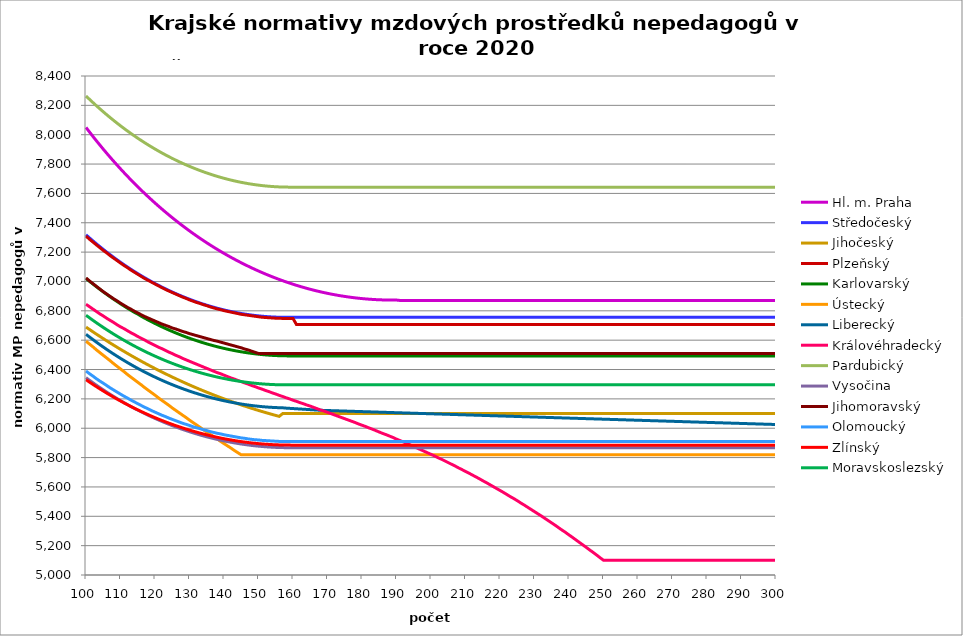
| Category | Hl. m. Praha | Středočeský | Jihočeský | Plzeňský | Karlovarský  | Ústecký   | Liberecký | Královéhradecký | Pardubický | Vysočina | Jihomoravský | Olomoucký | Zlínský | Moravskoslezský |
|---|---|---|---|---|---|---|---|---|---|---|---|---|---|---|
| 100.0 | 8049.459 | 7317.95 | 6689.328 | 7309.41 | 7020.45 | 6592.885 | 6640.033 | 6844.813 | 8263.735 | 6344.177 | 7024.173 | 6389.799 | 6330.586 | 6769.877 |
| 101.0 | 8018.772 | 7297.191 | 6673.159 | 7288.1 | 7001.348 | 6573.831 | 6621.872 | 6828.381 | 8241.249 | 6326.929 | 7003.797 | 6371.744 | 6314.544 | 6752.521 |
| 102.0 | 7988.661 | 7276.908 | 6657.222 | 7268.834 | 6982.672 | 6554.886 | 6604.117 | 6812.028 | 8219.266 | 6310.062 | 6985.376 | 6355.419 | 6298.856 | 6735.554 |
| 103.0 | 7959.116 | 7257.093 | 6641.513 | 7249.67 | 6964.418 | 6534.343 | 6586.763 | 6795.753 | 8197.779 | 6293.571 | 6967.051 | 6337.557 | 6283.516 | 6718.969 |
| 104.0 | 7930.127 | 7237.74 | 6626.03 | 7230.607 | 6946.579 | 6515.625 | 6569.805 | 6779.555 | 8176.781 | 6277.45 | 6948.823 | 6321.407 | 6268.52 | 6702.761 |
| 105.0 | 7901.684 | 7218.842 | 6610.77 | 7211.644 | 6929.15 | 6497.014 | 6553.236 | 6765.222 | 8156.265 | 6261.695 | 6930.689 | 6306.941 | 6253.863 | 6686.926 |
| 106.0 | 7873.778 | 7200.394 | 6595.731 | 7194.662 | 6912.125 | 6478.509 | 6537.053 | 6749.17 | 8136.226 | 6246.301 | 6914.449 | 6290.946 | 6239.542 | 6671.459 |
| 107.0 | 7846.399 | 7182.388 | 6580.909 | 7175.887 | 6895.5 | 6460.108 | 6521.249 | 6734.964 | 8116.656 | 6231.263 | 6898.286 | 6275.032 | 6225.551 | 6656.355 |
| 108.0 | 7819.538 | 7164.818 | 6566.303 | 7159.073 | 6879.268 | 6440.154 | 6505.82 | 6720.819 | 8097.549 | 6216.575 | 6882.197 | 6260.777 | 6211.888 | 6641.61 |
| 109.0 | 7793.187 | 7147.68 | 6551.91 | 7142.338 | 6863.425 | 6421.971 | 6490.761 | 6704.976 | 8078.901 | 6202.235 | 6867.96 | 6246.588 | 6198.547 | 6627.22 |
| 110.0 | 7767.338 | 7130.968 | 6537.728 | 7125.68 | 6847.966 | 6403.89 | 6476.067 | 6690.957 | 8060.704 | 6188.376 | 6852.012 | 6232.462 | 6185.526 | 6613.18 |
| 111.0 | 7741.982 | 7114.676 | 6523.755 | 7109.1 | 6832.887 | 6385.911 | 6461.734 | 6678.737 | 8042.954 | 6174.716 | 6837.899 | 6218.401 | 6172.821 | 6599.487 |
| 112.0 | 7717.11 | 7098.798 | 6509.987 | 7094.427 | 6818.182 | 6366.412 | 6447.758 | 6664.827 | 8025.645 | 6161.39 | 6823.844 | 6205.954 | 6160.428 | 6586.135 |
| 113.0 | 7692.717 | 7083.331 | 6496.424 | 7077.992 | 6803.847 | 6348.642 | 6434.134 | 6650.974 | 8008.773 | 6148.395 | 6811.593 | 6192.012 | 6148.343 | 6573.123 |
| 114.0 | 7668.793 | 7068.268 | 6483.062 | 7063.447 | 6789.879 | 6330.972 | 6420.858 | 6638.9 | 7992.331 | 6135.862 | 6797.645 | 6179.671 | 6136.564 | 6560.445 |
| 115.0 | 7645.332 | 7053.606 | 6469.9 | 7048.962 | 6777.967 | 6313.399 | 6407.927 | 6625.155 | 7976.315 | 6123.516 | 6785.488 | 6167.379 | 6125.087 | 6548.099 |
| 116.0 | 7622.326 | 7039.34 | 6456.935 | 7034.536 | 6763.025 | 6295.924 | 6395.336 | 6613.175 | 7960.72 | 6111.624 | 6773.374 | 6155.136 | 6113.91 | 6536.08 |
| 117.0 | 7599.769 | 7025.464 | 6444.166 | 7020.168 | 6750.131 | 6276.969 | 6383.082 | 6601.238 | 7945.543 | 6099.912 | 6761.303 | 6142.942 | 6103.028 | 6524.386 |
| 118.0 | 7577.653 | 7011.976 | 6431.59 | 7007.645 | 6737.587 | 6259.695 | 6371.161 | 6587.648 | 7930.778 | 6088.513 | 6750.991 | 6132.311 | 6092.439 | 6513.013 |
| 119.0 | 7555.973 | 6998.871 | 6419.205 | 6995.167 | 6725.39 | 6242.515 | 6359.57 | 6575.803 | 7916.42 | 6077.556 | 6740.711 | 6120.207 | 6082.14 | 6501.959 |
| 120.0 | 7534.722 | 6986.144 | 6407.01 | 6982.732 | 6713.536 | 6225.429 | 6348.305 | 6564 | 7902.467 | 6066.905 | 6730.461 | 6109.655 | 6072.129 | 6491.219 |
| 121.0 | 7513.894 | 6973.792 | 6395.003 | 6970.342 | 6702.022 | 6206.897 | 6337.363 | 6552.24 | 7888.914 | 6056.555 | 6720.243 | 6099.139 | 6062.402 | 6480.792 |
| 122.0 | 7493.482 | 6961.812 | 6383.182 | 6957.996 | 6690.844 | 6190.005 | 6326.742 | 6542.193 | 7875.757 | 6046.374 | 6710.056 | 6088.66 | 6052.958 | 6470.674 |
| 123.0 | 7473.481 | 6950.199 | 6371.544 | 6945.693 | 6680 | 6173.205 | 6316.437 | 6530.51 | 7862.993 | 6036.489 | 6701.59 | 6079.706 | 6043.793 | 6460.862 |
| 124.0 | 7453.886 | 6938.951 | 6360.089 | 6935.183 | 6669.487 | 6156.496 | 6306.446 | 6518.869 | 7850.617 | 6027.03 | 6693.145 | 6069.293 | 6034.906 | 6451.355 |
| 125.0 | 7434.69 | 6928.063 | 6348.814 | 6924.704 | 6659.3 | 6138.371 | 6296.767 | 6508.924 | 7838.627 | 6017.862 | 6683.04 | 6060.396 | 6026.293 | 6442.149 |
| 126.0 | 7415.888 | 6917.533 | 6337.718 | 6914.257 | 6649.438 | 6121.85 | 6287.396 | 6497.36 | 7827.018 | 6008.983 | 6676.32 | 6051.525 | 6017.954 | 6433.241 |
| 127.0 | 7397.475 | 6907.358 | 6326.8 | 6903.841 | 6639.898 | 6105.417 | 6278.331 | 6487.481 | 7815.789 | 6000.26 | 6667.939 | 6042.68 | 6009.885 | 6424.631 |
| 128.0 | 7379.446 | 6897.533 | 6316.056 | 6893.457 | 6630.677 | 6089.073 | 6269.569 | 6475.993 | 7804.935 | 5991.951 | 6659.579 | 6033.86 | 6002.084 | 6416.314 |
| 129.0 | 7361.797 | 6888.058 | 6305.487 | 6884.827 | 6621.773 | 6072.816 | 6261.108 | 6466.178 | 7794.453 | 5983.924 | 6652.906 | 6026.531 | 5994.55 | 6408.29 |
| 130.0 | 7344.521 | 6878.929 | 6295.09 | 6874.5 | 6613.182 | 6055.179 | 6252.946 | 6456.393 | 7784.342 | 5976.176 | 6644.583 | 6019.219 | 5987.28 | 6400.556 |
| 131.0 | 7327.615 | 6870.142 | 6284.863 | 6865.918 | 6604.904 | 6039.102 | 6245.08 | 6446.638 | 7774.597 | 5968.706 | 6637.941 | 6010.468 | 5980.273 | 6393.109 |
| 132.0 | 7311.074 | 6861.697 | 6274.806 | 6857.357 | 6596.935 | 6023.11 | 6237.508 | 6436.912 | 7765.217 | 5961.51 | 6631.311 | 6003.195 | 5973.527 | 6385.949 |
| 133.0 | 7294.894 | 6853.589 | 6264.917 | 6850.523 | 6589.273 | 6007.203 | 6230.229 | 6427.216 | 7756.199 | 5954.46 | 6624.694 | 5997.389 | 5967.041 | 6379.073 |
| 134.0 | 7279.07 | 6845.818 | 6255.194 | 6842 | 6581.917 | 5989.945 | 6223.24 | 6417.548 | 7747.54 | 5947.81 | 6618.091 | 5990.147 | 5960.811 | 6372.479 |
| 135.0 | 7263.598 | 6838.38 | 6245.637 | 6835.198 | 6574.864 | 5974.212 | 6216.538 | 6407.91 | 7739.238 | 5941.558 | 6611.501 | 5984.367 | 5954.838 | 6366.166 |
| 136.0 | 7248.475 | 6831.275 | 6236.243 | 6826.713 | 6568.113 | 5958.562 | 6210.124 | 6398.3 | 7731.29 | 5935.445 | 6604.924 | 5977.157 | 5949.119 | 6360.131 |
| 137.0 | 7233.695 | 6824.498 | 6227.011 | 6819.94 | 6561.661 | 5942.993 | 6203.994 | 6388.72 | 7723.696 | 5929.599 | 6598.36 | 5971.401 | 5943.654 | 6354.375 |
| 138.0 | 7219.256 | 6818.049 | 6217.94 | 6813.181 | 6555.507 | 5927.505 | 6198.147 | 6379.168 | 7716.452 | 5924.018 | 6593.446 | 5965.657 | 5938.44 | 6348.894 |
| 139.0 | 7205.153 | 6811.927 | 6209.029 | 6808.121 | 6549.649 | 5910.702 | 6192.582 | 6371.229 | 7709.557 | 5918.701 | 6586.905 | 5961.355 | 5933.476 | 6343.688 |
| 140.0 | 7191.384 | 6806.128 | 6200.276 | 6801.385 | 6544.086 | 5895.382 | 6187.296 | 6361.73 | 7703.008 | 5913.771 | 6580.377 | 5955.63 | 5928.762 | 6338.755 |
| 141.0 | 7177.944 | 6800.652 | 6191.68 | 6796.342 | 6538.816 | 5880.141 | 6182.289 | 6352.258 | 7696.805 | 5908.976 | 6573.861 | 5951.344 | 5924.295 | 6334.094 |
| 142.0 | 7164.83 | 6795.497 | 6183.241 | 6791.306 | 6533.838 | 5864.979 | 6177.56 | 6342.815 | 7690.945 | 5904.441 | 6567.359 | 5947.063 | 5920.076 | 6329.704 |
| 143.0 | 7152.038 | 6790.661 | 6174.956 | 6786.278 | 6529.15 | 5848.527 | 6173.107 | 6334.967 | 7685.428 | 5900.164 | 6560.87 | 5942.789 | 5916.102 | 6325.584 |
| 144.0 | 7139.567 | 6786.144 | 6166.825 | 6781.258 | 6524.752 | 5833.528 | 6168.928 | 6325.574 | 7680.25 | 5896.27 | 6554.393 | 5938.52 | 5912.373 | 6321.732 |
| 145.0 | 7127.412 | 6781.943 | 6158.847 | 6776.244 | 6520.641 | 5818.605 | 6165.023 | 6317.769 | 7675.412 | 5892.506 | 6547.929 | 5934.258 | 5908.888 | 6318.148 |
| 146.0 | 7115.571 | 6778.059 | 6151.019 | 6772.906 | 6516.818 | 5818.605 | 6161.391 | 6308.428 | 7670.912 | 5889.123 | 6539.867 | 5931.42 | 5905.647 | 6314.831 |
| 147.0 | 7104.04 | 6774.489 | 6143.343 | 6769.572 | 6513.281 | 5818.605 | 6158.031 | 6300.665 | 7666.748 | 5885.869 | 6533.432 | 5927.168 | 5902.647 | 6311.78 |
| 148.0 | 7092.817 | 6771.232 | 6135.815 | 6766.24 | 6510.029 | 5818.605 | 6154.941 | 6291.374 | 7662.92 | 5882.868 | 6525.405 | 5924.337 | 5899.889 | 6308.994 |
| 149.0 | 7081.899 | 6768.289 | 6128.436 | 6762.912 | 6507.061 | 5818.605 | 6152.122 | 6283.652 | 7659.427 | 5880.245 | 6517.399 | 5921.509 | 5897.373 | 6306.473 |
| 150.0 | 7071.283 | 6765.657 | 6121.204 | 6759.587 | 6504.377 | 5818.605 | 6149.572 | 6274.412 | 7656.267 | 5877.873 | 6509.412 | 5920.095 | 5895.096 | 6304.215 |
| 151.0 | 7060.967 | 6763.337 | 6114.119 | 6756.265 | 6501.976 | 5818.605 | 6147.29 | 6266.732 | 7653.441 | 5875.753 | 6509.412 | 5917.271 | 5893.059 | 6302.221 |
| 152.0 | 7050.949 | 6761.328 | 6107.178 | 6754.606 | 6499.856 | 5818.605 | 6145.277 | 6257.541 | 7650.946 | 5873.759 | 6509.412 | 5915.86 | 5891.261 | 6300.489 |
| 153.0 | 7041.225 | 6759.628 | 6100.383 | 6752.947 | 6498.018 | 5818.605 | 6143.531 | 6249.902 | 7648.783 | 5872.016 | 6509.412 | 5914.449 | 5889.703 | 6299.02 |
| 154.0 | 7031.794 | 6758.239 | 6093.73 | 6751.289 | 6496.462 | 5818.605 | 6142.052 | 6240.761 | 7646.951 | 5870.646 | 6509.412 | 5913.039 | 5888.382 | 6297.813 |
| 155.0 | 7022.654 | 6757.158 | 6087.221 | 6749.632 | 6495.186 | 5818.605 | 6140.84 | 6233.163 | 7645.449 | 5869.527 | 6509.412 | 5911.63 | 5887.3 | 6296.868 |
| 156.0 | 7013.801 | 6756.386 | 6080.853 | 6749.632 | 6494.191 | 5818.605 | 6139.894 | 6224.07 | 7644.277 | 5868.656 | 6509.412 | 5910.222 | 5886.456 | 6296.184 |
| 157.0 | 7005.235 | 6755.924 | 6099.74 | 6747.975 | 6493.475 | 5818.605 | 6139.215 | 6216.513 | 7643.435 | 5868.034 | 6509.412 | 5910.222 | 5885.849 | 6295.762 |
| 158.0 | 6996.953 | 6755.769 | 6099.74 | 6747.975 | 6493.04 | 5818.605 | 6137 | 6207.468 | 7642.923 | 5867.537 | 6509.412 | 5908.814 | 5885.479 | 6295.754 |
| 159.0 | 6988.953 | 6755.924 | 6099.74 | 6747.975 | 6492.885 | 5818.605 | 6135.525 | 6199.952 | 7642.74 | 5867.412 | 6509.412 | 5908.814 | 5885.348 | 6295.7 |
| 160.0 | 6981.233 | 6755.769 | 6099.74 | 6747.975 | 6493.009 | 5818.605 | 6134.05 | 6190.955 | 7642.52 | 5867.288 | 6509.412 | 5908.814 | 5883.871 | 6295.754 |
| 161.0 | 6973.792 | 6755.769 | 6099.74 | 6706.829 | 6492.698 | 5818.605 | 6132.576 | 6183.478 | 7642.52 | 5867.288 | 6509.412 | 5908.814 | 5883.871 | 6295.754 |
| 162.0 | 6966.628 | 6755.769 | 6099.74 | 6706.829 | 6492.698 | 5818.605 | 6131.102 | 6174.53 | 7642.52 | 5867.288 | 6509.412 | 5908.814 | 5883.871 | 6295.754 |
| 163.0 | 6959.738 | 6755.769 | 6099.74 | 6706.829 | 6492.698 | 5818.605 | 6129.629 | 6167.092 | 7642.52 | 5867.288 | 6509.412 | 5908.814 | 5883.871 | 6295.754 |
| 164.0 | 6953.122 | 6755.769 | 6099.74 | 6706.829 | 6492.698 | 5818.605 | 6128.157 | 6158.191 | 7642.52 | 5867.288 | 6509.412 | 5908.814 | 5883.871 | 6295.754 |
| 165.0 | 6946.779 | 6755.769 | 6099.74 | 6706.829 | 6492.698 | 5818.605 | 6126.686 | 6150.793 | 7642.52 | 5867.288 | 6509.412 | 5908.814 | 5883.871 | 6295.754 |
| 166.0 | 6940.705 | 6755.769 | 6099.74 | 6706.829 | 6492.698 | 5818.605 | 6125.215 | 6141.939 | 7642.52 | 5867.288 | 6509.412 | 5908.814 | 5883.871 | 6295.754 |
| 167.0 | 6934.901 | 6755.769 | 6099.74 | 6706.829 | 6492.698 | 5818.605 | 6123.745 | 6133.11 | 7642.52 | 5867.288 | 6509.412 | 5908.814 | 5883.871 | 6295.754 |
| 168.0 | 6929.365 | 6755.769 | 6099.74 | 6706.829 | 6492.698 | 5818.605 | 6122.276 | 6124.306 | 7642.52 | 5867.288 | 6509.412 | 5908.814 | 5883.871 | 6295.754 |
| 169.0 | 6924.096 | 6755.769 | 6099.74 | 6706.829 | 6492.698 | 5818.605 | 6121.412 | 6116.989 | 7642.52 | 5867.288 | 6509.412 | 5908.814 | 5883.871 | 6295.754 |
| 170.0 | 6919.091 | 6755.769 | 6099.74 | 6706.829 | 6492.698 | 5818.605 | 6120.808 | 6108.232 | 7642.52 | 5867.288 | 6509.412 | 5908.814 | 5883.871 | 6295.754 |
| 171.0 | 6914.351 | 6755.769 | 6099.74 | 6706.829 | 6492.698 | 5818.605 | 6120.01 | 6099.5 | 7642.52 | 5867.288 | 6509.412 | 5908.814 | 5883.871 | 6295.754 |
| 172.0 | 6909.874 | 6755.769 | 6099.74 | 6706.829 | 6492.698 | 5818.605 | 6119.265 | 6090.792 | 7642.52 | 5867.288 | 6509.412 | 5908.814 | 5883.871 | 6295.754 |
| 173.0 | 6905.66 | 6755.769 | 6099.74 | 6706.829 | 6492.698 | 5818.605 | 6118.521 | 6082.11 | 7642.52 | 5867.288 | 6509.412 | 5908.814 | 5883.871 | 6295.754 |
| 174.0 | 6901.706 | 6755.769 | 6099.74 | 6706.829 | 6492.698 | 5818.605 | 6117.776 | 6073.452 | 7642.52 | 5867.288 | 6509.412 | 5908.814 | 5883.871 | 6295.754 |
| 175.0 | 6898.013 | 6755.769 | 6099.74 | 6706.829 | 6492.698 | 5818.605 | 6117.031 | 6064.819 | 7642.52 | 5867.288 | 6509.412 | 5908.814 | 5883.871 | 6295.754 |
| 176.0 | 6894.58 | 6755.769 | 6099.74 | 6706.829 | 6492.698 | 5818.605 | 6116.287 | 6056.21 | 7642.52 | 5867.288 | 6509.412 | 5908.814 | 5883.871 | 6295.754 |
| 177.0 | 6891.405 | 6755.769 | 6099.74 | 6706.829 | 6492.698 | 5818.605 | 6115.543 | 6047.626 | 7642.52 | 5867.288 | 6509.412 | 5908.814 | 5883.871 | 6295.754 |
| 178.0 | 6888.488 | 6755.769 | 6099.74 | 6706.829 | 6492.698 | 5818.605 | 6114.799 | 6039.066 | 7642.52 | 5867.288 | 6509.412 | 5908.814 | 5883.871 | 6295.754 |
| 179.0 | 6885.829 | 6755.769 | 6099.74 | 6706.829 | 6492.698 | 5818.605 | 6114.056 | 6029.11 | 7642.52 | 5867.288 | 6509.412 | 5908.814 | 5883.871 | 6295.754 |
| 180.0 | 6883.426 | 6755.769 | 6099.74 | 6706.829 | 6492.698 | 5818.605 | 6113.312 | 6020.602 | 7642.52 | 5867.288 | 6509.412 | 5908.814 | 5883.871 | 6295.754 |
| 181.0 | 6881.279 | 6755.769 | 6099.74 | 6706.829 | 6492.698 | 5818.605 | 6112.569 | 6012.118 | 7642.52 | 5867.288 | 6509.412 | 5908.814 | 5883.871 | 6295.754 |
| 182.0 | 6879.389 | 6755.769 | 6099.74 | 6706.829 | 6492.698 | 5818.605 | 6111.825 | 6002.251 | 7642.52 | 5867.288 | 6509.412 | 5908.814 | 5883.871 | 6295.754 |
| 183.0 | 6877.753 | 6755.769 | 6099.74 | 6706.829 | 6492.698 | 5818.605 | 6111.083 | 5993.819 | 7642.52 | 5867.288 | 6509.412 | 5908.814 | 5883.871 | 6295.754 |
| 184.0 | 6876.373 | 6755.769 | 6099.74 | 6706.829 | 6492.698 | 5818.605 | 6110.34 | 5984.011 | 7642.52 | 5867.288 | 6509.412 | 5908.814 | 5883.871 | 6295.754 |
| 185.0 | 6875.248 | 6755.769 | 6099.74 | 6706.829 | 6492.698 | 5818.605 | 6109.597 | 5974.236 | 7642.52 | 5867.288 | 6509.412 | 5908.814 | 5883.871 | 6295.754 |
| 186.0 | 6874.376 | 6755.769 | 6099.74 | 6706.829 | 6492.698 | 5818.605 | 6108.855 | 5964.492 | 7642.52 | 5867.288 | 6509.412 | 5908.814 | 5883.871 | 6295.754 |
| 187.0 | 6873.759 | 6755.769 | 6099.74 | 6706.829 | 6492.698 | 5818.605 | 6108.112 | 5956.166 | 7642.52 | 5867.288 | 6509.412 | 5908.814 | 5883.871 | 6295.754 |
| 188.0 | 6873.396 | 6755.769 | 6099.74 | 6706.829 | 6492.698 | 5818.605 | 6107.37 | 5946.481 | 7642.52 | 5867.288 | 6509.412 | 5908.814 | 5883.871 | 6295.754 |
| 189.0 | 6873.288 | 6755.769 | 6099.74 | 6706.829 | 6492.698 | 5818.605 | 6106.628 | 5936.827 | 7642.52 | 5867.288 | 6509.412 | 5908.814 | 5883.871 | 6295.754 |
| 190.0 | 6873.433 | 6755.769 | 6099.74 | 6706.829 | 6492.698 | 5818.605 | 6105.887 | 5925.833 | 7642.52 | 5867.288 | 6509.412 | 5908.814 | 5883.871 | 6295.754 |
| 191.0 | 6870.712 | 6755.769 | 6099.74 | 6706.829 | 6492.698 | 5818.605 | 6105.145 | 5916.247 | 7642.52 | 5867.288 | 6509.412 | 5908.814 | 5883.871 | 6295.754 |
| 192.0 | 6870.712 | 6755.769 | 6099.74 | 6706.829 | 6492.698 | 5818.605 | 6104.404 | 5906.691 | 7642.52 | 5867.288 | 6509.412 | 5908.814 | 5883.871 | 6295.754 |
| 193.0 | 6870.712 | 6755.769 | 6099.74 | 6706.829 | 6492.698 | 5818.605 | 6103.663 | 5895.808 | 7642.52 | 5867.288 | 6509.412 | 5908.814 | 5883.871 | 6295.754 |
| 194.0 | 6870.712 | 6755.769 | 6099.74 | 6706.829 | 6492.698 | 5818.605 | 6102.922 | 5886.319 | 7642.52 | 5867.288 | 6509.412 | 5908.814 | 5883.871 | 6295.754 |
| 195.0 | 6870.712 | 6755.769 | 6099.74 | 6706.829 | 6492.698 | 5818.605 | 6102.181 | 5875.511 | 7642.52 | 5867.288 | 6509.412 | 5908.814 | 5883.871 | 6295.754 |
| 196.0 | 6870.712 | 6755.769 | 6099.74 | 6706.829 | 6492.698 | 5818.605 | 6101.44 | 5864.742 | 7642.52 | 5867.288 | 6509.412 | 5908.814 | 5883.871 | 6295.754 |
| 197.0 | 6870.712 | 6755.769 | 6099.74 | 6706.829 | 6492.698 | 5818.605 | 6100.7 | 5854.013 | 7642.52 | 5867.288 | 6509.412 | 5908.814 | 5883.871 | 6295.754 |
| 198.0 | 6870.712 | 6755.769 | 6099.74 | 6706.829 | 6492.698 | 5818.605 | 6099.959 | 5843.323 | 7642.52 | 5867.288 | 6509.412 | 5908.814 | 5883.871 | 6295.754 |
| 199.0 | 6870.712 | 6755.769 | 6099.74 | 6706.829 | 6492.698 | 5818.605 | 6099.219 | 5832.673 | 7642.52 | 5867.288 | 6509.412 | 5908.814 | 5883.871 | 6295.754 |
| 200.0 | 6870.712 | 6755.769 | 6099.74 | 6706.829 | 6492.698 | 5818.605 | 6098.479 | 5822.06 | 7642.52 | 5867.288 | 6509.412 | 5908.814 | 5883.871 | 6295.754 |
| 201.0 | 6870.712 | 6755.769 | 6099.74 | 6706.829 | 6492.698 | 5818.605 | 6097.74 | 5811.487 | 7642.52 | 5867.288 | 6509.412 | 5908.814 | 5883.871 | 6295.754 |
| 202.0 | 6870.712 | 6755.769 | 6099.74 | 6706.829 | 6492.698 | 5818.605 | 6097 | 5799.638 | 7642.52 | 5867.288 | 6509.412 | 5908.814 | 5883.871 | 6295.754 |
| 203.0 | 6870.712 | 6755.769 | 6099.74 | 6706.829 | 6492.698 | 5818.605 | 6096.261 | 5789.145 | 7642.52 | 5867.288 | 6509.412 | 5908.814 | 5883.871 | 6295.754 |
| 204.0 | 6870.712 | 6755.769 | 6099.74 | 6706.829 | 6492.698 | 5818.605 | 6095.521 | 5777.387 | 7642.52 | 5867.288 | 6509.412 | 5908.814 | 5883.871 | 6295.754 |
| 205.0 | 6870.712 | 6755.769 | 6099.74 | 6706.829 | 6492.698 | 5818.605 | 6094.782 | 5765.676 | 7642.52 | 5867.288 | 6509.412 | 5908.814 | 5883.871 | 6295.754 |
| 206.0 | 6870.712 | 6755.769 | 6099.74 | 6706.829 | 6492.698 | 5818.605 | 6094.043 | 5754.012 | 7642.52 | 5867.288 | 6509.412 | 5908.814 | 5883.871 | 6295.754 |
| 207.0 | 6870.712 | 6755.769 | 6099.74 | 6706.829 | 6492.698 | 5818.605 | 6093.305 | 5742.396 | 7642.52 | 5867.288 | 6509.412 | 5908.814 | 5883.871 | 6295.754 |
| 208.0 | 6870.712 | 6755.769 | 6099.74 | 6706.829 | 6492.698 | 5818.605 | 6092.566 | 5729.543 | 7642.52 | 5867.288 | 6509.412 | 5908.814 | 5883.871 | 6295.754 |
| 209.0 | 6870.712 | 6755.769 | 6099.74 | 6706.829 | 6492.698 | 5818.605 | 6091.828 | 5718.025 | 7642.52 | 5867.288 | 6509.412 | 5908.814 | 5883.871 | 6295.754 |
| 210.0 | 6870.712 | 6755.769 | 6099.74 | 6706.829 | 6492.698 | 5818.605 | 6091.09 | 5705.282 | 7642.52 | 5867.288 | 6509.412 | 5908.814 | 5883.871 | 6295.754 |
| 211.0 | 6870.712 | 6755.769 | 6099.74 | 6706.829 | 6492.698 | 5818.605 | 6090.352 | 5693.861 | 7642.52 | 5867.288 | 6509.412 | 5908.814 | 5883.871 | 6295.754 |
| 212.0 | 6870.712 | 6755.769 | 6099.74 | 6706.829 | 6492.698 | 5818.605 | 6089.614 | 5681.225 | 7642.52 | 5867.288 | 6509.412 | 5908.814 | 5883.871 | 6295.754 |
| 213.0 | 6870.712 | 6755.769 | 6099.74 | 6706.829 | 6492.698 | 5818.605 | 6088.877 | 5668.645 | 7642.52 | 5867.288 | 6509.412 | 5908.814 | 5883.871 | 6295.754 |
| 214.0 | 6870.712 | 6755.769 | 6099.74 | 6706.829 | 6492.698 | 5818.605 | 6088.139 | 5656.12 | 7642.52 | 5867.288 | 6509.412 | 5908.814 | 5883.871 | 6295.754 |
| 215.0 | 6870.712 | 6755.769 | 6099.74 | 6706.829 | 6492.698 | 5818.605 | 6087.402 | 5642.407 | 7642.52 | 5867.288 | 6509.412 | 5908.814 | 5883.871 | 6295.754 |
| 216.0 | 6870.712 | 6755.769 | 6099.74 | 6706.829 | 6492.698 | 5818.605 | 6086.665 | 5629.998 | 7642.52 | 5867.288 | 6509.412 | 5908.814 | 5883.871 | 6295.754 |
| 217.0 | 6870.712 | 6755.769 | 6099.74 | 6706.829 | 6492.698 | 5818.605 | 6085.928 | 5616.411 | 7642.52 | 5867.288 | 6509.412 | 5908.814 | 5883.871 | 6295.754 |
| 218.0 | 6870.712 | 6755.769 | 6099.74 | 6706.829 | 6492.698 | 5818.605 | 6085.191 | 5602.889 | 7642.52 | 5867.288 | 6509.412 | 5908.814 | 5883.871 | 6295.754 |
| 219.0 | 6870.712 | 6755.769 | 6099.74 | 6706.829 | 6492.698 | 5818.605 | 6084.455 | 5589.432 | 7642.52 | 5867.288 | 6509.412 | 5908.814 | 5883.871 | 6295.754 |
| 220.0 | 6870.712 | 6755.769 | 6099.74 | 6706.829 | 6492.698 | 5818.605 | 6083.718 | 5576.04 | 7642.52 | 5867.288 | 6509.412 | 5908.814 | 5883.871 | 6295.754 |
| 221.0 | 6870.712 | 6755.769 | 6099.74 | 6706.829 | 6492.698 | 5818.605 | 6082.982 | 5562.712 | 7642.52 | 5867.288 | 6509.412 | 5908.814 | 5883.871 | 6295.754 |
| 222.0 | 6870.712 | 6755.769 | 6099.74 | 6706.829 | 6492.698 | 5818.605 | 6082.246 | 5548.244 | 7642.52 | 5867.288 | 6509.412 | 5908.814 | 5883.871 | 6295.754 |
| 223.0 | 6870.712 | 6755.769 | 6099.74 | 6706.829 | 6492.698 | 5818.605 | 6081.51 | 5533.852 | 7642.52 | 5867.288 | 6509.412 | 5908.814 | 5883.871 | 6295.754 |
| 224.0 | 6870.712 | 6755.769 | 6099.74 | 6706.829 | 6492.698 | 5818.605 | 6080.775 | 5520.725 | 7642.52 | 5867.288 | 6509.412 | 5908.814 | 5883.871 | 6295.754 |
| 225.0 | 6870.712 | 6755.769 | 6099.74 | 6706.829 | 6492.698 | 5818.605 | 6080.039 | 5506.475 | 7642.52 | 5867.288 | 6509.412 | 5908.814 | 5883.871 | 6295.754 |
| 226.0 | 6870.712 | 6755.769 | 6099.74 | 6706.829 | 6492.698 | 5818.605 | 6079.304 | 5491.12 | 7642.52 | 5867.288 | 6509.412 | 5908.814 | 5883.871 | 6295.754 |
| 227.0 | 6870.712 | 6755.769 | 6099.74 | 6706.829 | 6492.698 | 5818.605 | 6078.569 | 5477.022 | 7642.52 | 5867.288 | 6509.412 | 5908.814 | 5883.871 | 6295.754 |
| 228.0 | 6870.712 | 6755.769 | 6099.74 | 6706.829 | 6492.698 | 5818.605 | 6077.834 | 5461.831 | 7642.52 | 5867.288 | 6509.412 | 5908.814 | 5883.871 | 6295.754 |
| 229.0 | 6870.712 | 6755.769 | 6099.74 | 6706.829 | 6492.698 | 5818.605 | 6077.099 | 5446.723 | 7642.52 | 5867.288 | 6509.412 | 5908.814 | 5883.871 | 6295.754 |
| 230.0 | 6870.712 | 6755.769 | 6099.74 | 6706.829 | 6492.698 | 5818.605 | 6076.365 | 5431.7 | 7642.52 | 5867.288 | 6509.412 | 5908.814 | 5883.871 | 6295.754 |
| 231.0 | 6870.712 | 6755.769 | 6099.74 | 6706.829 | 6492.698 | 5818.605 | 6075.63 | 5416.758 | 7642.52 | 5867.288 | 6509.412 | 5908.814 | 5883.871 | 6295.754 |
| 232.0 | 6870.712 | 6755.769 | 6099.74 | 6706.829 | 6492.698 | 5818.605 | 6074.896 | 5401.899 | 7642.52 | 5867.288 | 6509.412 | 5908.814 | 5883.871 | 6295.754 |
| 233.0 | 6870.712 | 6755.769 | 6099.74 | 6706.829 | 6492.698 | 5818.605 | 6074.162 | 5385.988 | 7642.52 | 5867.288 | 6509.412 | 5908.814 | 5883.871 | 6295.754 |
| 234.0 | 6870.712 | 6755.769 | 6099.74 | 6706.829 | 6492.698 | 5818.605 | 6073.428 | 5370.17 | 7642.52 | 5867.288 | 6509.412 | 5908.814 | 5883.871 | 6295.754 |
| 235.0 | 6870.712 | 6755.769 | 6099.74 | 6706.829 | 6492.698 | 5818.605 | 6072.694 | 5354.445 | 7642.52 | 5867.288 | 6509.412 | 5908.814 | 5883.871 | 6295.754 |
| 236.0 | 6870.712 | 6755.769 | 6099.74 | 6706.829 | 6492.698 | 5818.605 | 6071.961 | 5338.811 | 7642.52 | 5867.288 | 6509.412 | 5908.814 | 5883.871 | 6295.754 |
| 237.0 | 6870.712 | 6755.769 | 6099.74 | 6706.829 | 6492.698 | 5818.605 | 6071.228 | 5322.162 | 7642.52 | 5867.288 | 6509.412 | 5908.814 | 5883.871 | 6295.754 |
| 238.0 | 6870.712 | 6755.769 | 6099.74 | 6706.829 | 6492.698 | 5818.605 | 6070.494 | 5305.617 | 7642.52 | 5867.288 | 6509.412 | 5908.814 | 5883.871 | 6295.754 |
| 239.0 | 6870.712 | 6755.769 | 6099.74 | 6706.829 | 6492.698 | 5818.605 | 6069.761 | 5290.267 | 7642.52 | 5867.288 | 6509.412 | 5908.814 | 5883.871 | 6295.754 |
| 240.0 | 6870.712 | 6755.769 | 6099.74 | 6706.829 | 6492.698 | 5818.605 | 6069.029 | 5272.832 | 7642.52 | 5867.288 | 6509.412 | 5908.814 | 5883.871 | 6295.754 |
| 241.0 | 6870.712 | 6755.769 | 6099.74 | 6706.829 | 6492.698 | 5818.605 | 6068.296 | 5256.591 | 7642.52 | 5867.288 | 6509.412 | 5908.814 | 5883.871 | 6295.754 |
| 242.0 | 6870.712 | 6755.769 | 6099.74 | 6706.829 | 6492.698 | 5818.605 | 6067.564 | 5239.378 | 7642.52 | 5867.288 | 6509.412 | 5908.814 | 5883.871 | 6295.754 |
| 243.0 | 6870.712 | 6755.769 | 6099.74 | 6706.829 | 6492.698 | 5818.605 | 6066.831 | 5222.277 | 7642.52 | 5867.288 | 6509.412 | 5908.814 | 5883.871 | 6295.754 |
| 244.0 | 6870.712 | 6755.769 | 6099.74 | 6706.829 | 6492.698 | 5818.605 | 6066.099 | 5205.287 | 7642.52 | 5867.288 | 6509.412 | 5908.814 | 5883.871 | 6295.754 |
| 245.0 | 6870.712 | 6755.769 | 6099.74 | 6706.829 | 6492.698 | 5818.605 | 6065.367 | 5188.407 | 7642.52 | 5867.288 | 6509.412 | 5908.814 | 5883.871 | 6295.754 |
| 246.0 | 6870.712 | 6755.769 | 6099.74 | 6706.829 | 6492.698 | 5818.605 | 6064.636 | 5170.592 | 7642.52 | 5867.288 | 6509.412 | 5908.814 | 5883.871 | 6295.754 |
| 247.0 | 6870.712 | 6755.769 | 6099.74 | 6706.829 | 6492.698 | 5818.605 | 6063.904 | 5153.936 | 7642.52 | 5867.288 | 6509.412 | 5908.814 | 5883.871 | 6295.754 |
| 248.0 | 6870.712 | 6755.769 | 6099.74 | 6706.829 | 6492.698 | 5818.605 | 6063.173 | 5136.356 | 7642.52 | 5867.288 | 6509.412 | 5908.814 | 5883.871 | 6295.754 |
| 249.0 | 6870.712 | 6755.769 | 6099.74 | 6706.829 | 6492.698 | 5818.605 | 6062.441 | 5117.873 | 7642.52 | 5867.288 | 6509.412 | 5908.814 | 5883.871 | 6295.754 |
| 250.0 | 6870.712 | 6755.769 | 6099.74 | 6706.829 | 6492.698 | 5818.605 | 6061.71 | 5100.538 | 7642.52 | 5867.288 | 6509.412 | 5908.814 | 5883.871 | 6295.754 |
| 251.0 | 6870.712 | 6755.769 | 6099.74 | 6706.829 | 6492.698 | 5818.605 | 6060.98 | 5100.538 | 7642.52 | 5867.288 | 6509.412 | 5908.814 | 5883.871 | 6295.754 |
| 252.0 | 6870.712 | 6755.769 | 6099.74 | 6706.829 | 6492.698 | 5818.605 | 6060.249 | 5100.538 | 7642.52 | 5867.288 | 6509.412 | 5908.814 | 5883.871 | 6295.754 |
| 253.0 | 6870.712 | 6755.769 | 6099.74 | 6706.829 | 6492.698 | 5818.605 | 6059.518 | 5100.538 | 7642.52 | 5867.288 | 6509.412 | 5908.814 | 5883.871 | 6295.754 |
| 254.0 | 6870.712 | 6755.769 | 6099.74 | 6706.829 | 6492.698 | 5818.605 | 6058.788 | 5100.538 | 7642.52 | 5867.288 | 6509.412 | 5908.814 | 5883.871 | 6295.754 |
| 255.0 | 6870.712 | 6755.769 | 6099.74 | 6706.829 | 6492.698 | 5818.605 | 6058.058 | 5100.538 | 7642.52 | 5867.288 | 6509.412 | 5908.814 | 5883.871 | 6295.754 |
| 256.0 | 6870.712 | 6755.769 | 6099.74 | 6706.829 | 6492.698 | 5818.605 | 6057.328 | 5100.538 | 7642.52 | 5867.288 | 6509.412 | 5908.814 | 5883.871 | 6295.754 |
| 257.0 | 6870.712 | 6755.769 | 6099.74 | 6706.829 | 6492.698 | 5818.605 | 6056.598 | 5100.538 | 7642.52 | 5867.288 | 6509.412 | 5908.814 | 5883.871 | 6295.754 |
| 258.0 | 6870.712 | 6755.769 | 6099.74 | 6706.829 | 6492.698 | 5818.605 | 6055.869 | 5100.538 | 7642.52 | 5867.288 | 6509.412 | 5908.814 | 5883.871 | 6295.754 |
| 259.0 | 6870.712 | 6755.769 | 6099.74 | 6706.829 | 6492.698 | 5818.605 | 6055.139 | 5100.538 | 7642.52 | 5867.288 | 6509.412 | 5908.814 | 5883.871 | 6295.754 |
| 260.0 | 6870.712 | 6755.769 | 6099.74 | 6706.829 | 6492.698 | 5818.605 | 6054.41 | 5100.538 | 7642.52 | 5867.288 | 6509.412 | 5908.814 | 5883.871 | 6295.754 |
| 261.0 | 6870.712 | 6755.769 | 6099.74 | 6706.829 | 6492.698 | 5818.605 | 6053.681 | 5100.538 | 7642.52 | 5867.288 | 6509.412 | 5908.814 | 5883.871 | 6295.754 |
| 262.0 | 6870.712 | 6755.769 | 6099.74 | 6706.829 | 6492.698 | 5818.605 | 6052.952 | 5100.538 | 7642.52 | 5867.288 | 6509.412 | 5908.814 | 5883.871 | 6295.754 |
| 263.0 | 6870.712 | 6755.769 | 6099.74 | 6706.829 | 6492.698 | 5818.605 | 6052.223 | 5100.538 | 7642.52 | 5867.288 | 6509.412 | 5908.814 | 5883.871 | 6295.754 |
| 264.0 | 6870.712 | 6755.769 | 6099.74 | 6706.829 | 6492.698 | 5818.605 | 6051.494 | 5100.538 | 7642.52 | 5867.288 | 6509.412 | 5908.814 | 5883.871 | 6295.754 |
| 265.0 | 6870.712 | 6755.769 | 6099.74 | 6706.829 | 6492.698 | 5818.605 | 6050.766 | 5100.538 | 7642.52 | 5867.288 | 6509.412 | 5908.814 | 5883.871 | 6295.754 |
| 266.0 | 6870.712 | 6755.769 | 6099.74 | 6706.829 | 6492.698 | 5818.605 | 6050.038 | 5100.538 | 7642.52 | 5867.288 | 6509.412 | 5908.814 | 5883.871 | 6295.754 |
| 267.0 | 6870.712 | 6755.769 | 6099.74 | 6706.829 | 6492.698 | 5818.605 | 6049.31 | 5100.538 | 7642.52 | 5867.288 | 6509.412 | 5908.814 | 5883.871 | 6295.754 |
| 268.0 | 6870.712 | 6755.769 | 6099.74 | 6706.829 | 6492.698 | 5818.605 | 6048.582 | 5100.538 | 7642.52 | 5867.288 | 6509.412 | 5908.814 | 5883.871 | 6295.754 |
| 269.0 | 6870.712 | 6755.769 | 6099.74 | 6706.829 | 6492.698 | 5818.605 | 6047.854 | 5100.538 | 7642.52 | 5867.288 | 6509.412 | 5908.814 | 5883.871 | 6295.754 |
| 270.0 | 6870.712 | 6755.769 | 6099.74 | 6706.829 | 6492.698 | 5818.605 | 6047.127 | 5100.538 | 7642.52 | 5867.288 | 6509.412 | 5908.814 | 5883.871 | 6295.754 |
| 271.0 | 6870.712 | 6755.769 | 6099.74 | 6706.829 | 6492.698 | 5818.605 | 6046.399 | 5100.538 | 7642.52 | 5867.288 | 6509.412 | 5908.814 | 5883.871 | 6295.754 |
| 272.0 | 6870.712 | 6755.769 | 6099.74 | 6706.829 | 6492.698 | 5818.605 | 6045.672 | 5100.538 | 7642.52 | 5867.288 | 6509.412 | 5908.814 | 5883.871 | 6295.754 |
| 273.0 | 6870.712 | 6755.769 | 6099.74 | 6706.829 | 6492.698 | 5818.605 | 6044.945 | 5100.538 | 7642.52 | 5867.288 | 6509.412 | 5908.814 | 5883.871 | 6295.754 |
| 274.0 | 6870.712 | 6755.769 | 6099.74 | 6706.829 | 6492.698 | 5818.605 | 6044.218 | 5100.538 | 7642.52 | 5867.288 | 6509.412 | 5908.814 | 5883.871 | 6295.754 |
| 275.0 | 6870.712 | 6755.769 | 6099.74 | 6706.829 | 6492.698 | 5818.605 | 6043.492 | 5100.538 | 7642.52 | 5867.288 | 6509.412 | 5908.814 | 5883.871 | 6295.754 |
| 276.0 | 6870.712 | 6755.769 | 6099.74 | 6706.829 | 6492.698 | 5818.605 | 6042.765 | 5100.538 | 7642.52 | 5867.288 | 6509.412 | 5908.814 | 5883.871 | 6295.754 |
| 277.0 | 6870.712 | 6755.769 | 6099.74 | 6706.829 | 6492.698 | 5818.605 | 6042.039 | 5100.538 | 7642.52 | 5867.288 | 6509.412 | 5908.814 | 5883.871 | 6295.754 |
| 278.0 | 6870.712 | 6755.769 | 6099.74 | 6706.829 | 6492.698 | 5818.605 | 6041.313 | 5100.538 | 7642.52 | 5867.288 | 6509.412 | 5908.814 | 5883.871 | 6295.754 |
| 279.0 | 6870.712 | 6755.769 | 6099.74 | 6706.829 | 6492.698 | 5818.605 | 6040.587 | 5100.538 | 7642.52 | 5867.288 | 6509.412 | 5908.814 | 5883.871 | 6295.754 |
| 280.0 | 6870.712 | 6755.769 | 6099.74 | 6706.829 | 6492.698 | 5818.605 | 6039.861 | 5100.538 | 7642.52 | 5867.288 | 6509.412 | 5908.814 | 5883.871 | 6295.754 |
| 281.0 | 6870.712 | 6755.769 | 6099.74 | 6706.829 | 6492.698 | 5818.605 | 6039.136 | 5100.538 | 7642.52 | 5867.288 | 6509.412 | 5908.814 | 5883.871 | 6295.754 |
| 282.0 | 6870.712 | 6755.769 | 6099.74 | 6706.829 | 6492.698 | 5818.605 | 6038.41 | 5100.538 | 7642.52 | 5867.288 | 6509.412 | 5908.814 | 5883.871 | 6295.754 |
| 283.0 | 6870.712 | 6755.769 | 6099.74 | 6706.829 | 6492.698 | 5818.605 | 6037.685 | 5100.538 | 7642.52 | 5867.288 | 6509.412 | 5908.814 | 5883.871 | 6295.754 |
| 284.0 | 6870.712 | 6755.769 | 6099.74 | 6706.829 | 6492.698 | 5818.605 | 6036.96 | 5100.538 | 7642.52 | 5867.288 | 6509.412 | 5908.814 | 5883.871 | 6295.754 |
| 285.0 | 6870.712 | 6755.769 | 6099.74 | 6706.829 | 6492.698 | 5818.605 | 6036.235 | 5100.538 | 7642.52 | 5867.288 | 6509.412 | 5908.814 | 5883.871 | 6295.754 |
| 286.0 | 6870.712 | 6755.769 | 6099.74 | 6706.829 | 6492.698 | 5818.605 | 6035.51 | 5100.538 | 7642.52 | 5867.288 | 6509.412 | 5908.814 | 5883.871 | 6295.754 |
| 287.0 | 6870.712 | 6755.769 | 6099.74 | 6706.829 | 6492.698 | 5818.605 | 6034.786 | 5100.538 | 7642.52 | 5867.288 | 6509.412 | 5908.814 | 5883.871 | 6295.754 |
| 288.0 | 6870.712 | 6755.769 | 6099.74 | 6706.829 | 6492.698 | 5818.605 | 6034.061 | 5100.538 | 7642.52 | 5867.288 | 6509.412 | 5908.814 | 5883.871 | 6295.754 |
| 289.0 | 6870.712 | 6755.769 | 6099.74 | 6706.829 | 6492.698 | 5818.605 | 6033.337 | 5100.538 | 7642.52 | 5867.288 | 6509.412 | 5908.814 | 5883.871 | 6295.754 |
| 290.0 | 6870.712 | 6755.769 | 6099.74 | 6706.829 | 6492.698 | 5818.605 | 6032.613 | 5100.538 | 7642.52 | 5867.288 | 6509.412 | 5908.814 | 5883.871 | 6295.754 |
| 291.0 | 6870.712 | 6755.769 | 6099.74 | 6706.829 | 6492.698 | 5818.605 | 6031.889 | 5100.538 | 7642.52 | 5867.288 | 6509.412 | 5908.814 | 5883.871 | 6295.754 |
| 292.0 | 6870.712 | 6755.769 | 6099.74 | 6706.829 | 6492.698 | 5818.605 | 6031.166 | 5100.538 | 7642.52 | 5867.288 | 6509.412 | 5908.814 | 5883.871 | 6295.754 |
| 293.0 | 6870.712 | 6755.769 | 6099.74 | 6706.829 | 6492.698 | 5818.605 | 6030.442 | 5100.538 | 7642.52 | 5867.288 | 6509.412 | 5908.814 | 5883.871 | 6295.754 |
| 294.0 | 6870.712 | 6755.769 | 6099.74 | 6706.829 | 6492.698 | 5818.605 | 6029.719 | 5100.538 | 7642.52 | 5867.288 | 6509.412 | 5908.814 | 5883.871 | 6295.754 |
| 295.0 | 6870.712 | 6755.769 | 6099.74 | 6706.829 | 6492.698 | 5818.605 | 6028.996 | 5100.538 | 7642.52 | 5867.288 | 6509.412 | 5908.814 | 5883.871 | 6295.754 |
| 296.0 | 6870.712 | 6755.769 | 6099.74 | 6706.829 | 6492.698 | 5818.605 | 6028.273 | 5100.538 | 7642.52 | 5867.288 | 6509.412 | 5908.814 | 5883.871 | 6295.754 |
| 297.0 | 6870.712 | 6755.769 | 6099.74 | 6706.829 | 6492.698 | 5818.605 | 6027.55 | 5100.538 | 7642.52 | 5867.288 | 6509.412 | 5908.814 | 5883.871 | 6295.754 |
| 298.0 | 6870.712 | 6755.769 | 6099.74 | 6706.829 | 6492.698 | 5818.605 | 6026.827 | 5100.538 | 7642.52 | 5867.288 | 6509.412 | 5908.814 | 5883.871 | 6295.754 |
| 299.0 | 6870.712 | 6755.769 | 6099.74 | 6706.829 | 6492.698 | 5818.605 | 6026.105 | 5100.538 | 7642.52 | 5867.288 | 6509.412 | 5908.814 | 5883.871 | 6295.754 |
| 300.0 | 6870.712 | 6755.769 | 6099.74 | 6706.829 | 6492.698 | 5818.605 | 6025.382 | 5100.538 | 7642.52 | 5867.288 | 6509.412 | 5908.814 | 5883.871 | 6295.754 |